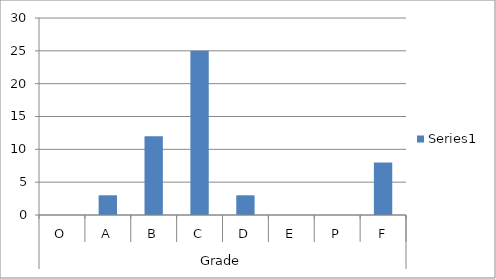
| Category | Series 0 |
|---|---|
| 0 | 0 |
| 1 | 3 |
| 2 | 12 |
| 3 | 25 |
| 4 | 3 |
| 5 | 0 |
| 6 | 0 |
| 7 | 8 |